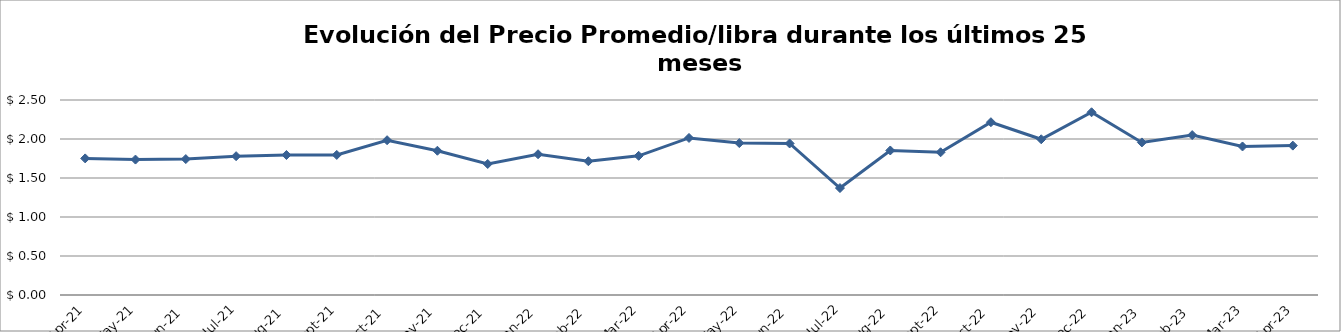
| Category | Series 0 |
|---|---|
| 2021-04-01 | 1.751 |
| 2021-05-01 | 1.736 |
| 2021-06-01 | 1.743 |
| 2021-07-01 | 1.78 |
| 2021-08-01 | 1.795 |
| 2021-09-01 | 1.796 |
| 2021-10-01 | 1.985 |
| 2021-11-01 | 1.849 |
| 2021-12-01 | 1.68 |
| 2022-01-01 | 1.805 |
| 2022-02-01 | 1.715 |
| 2022-03-01 | 1.784 |
| 2022-04-01 | 2.013 |
| 2022-05-01 | 1.948 |
| 2022-06-01 | 1.943 |
| 2022-07-01 | 1.371 |
| 2022-08-01 | 1.853 |
| 2022-09-01 | 1.83 |
| 2022-10-01 | 2.215 |
| 2022-11-01 | 1.996 |
| 2022-12-01 | 2.343 |
| 2023-01-01 | 1.956 |
| 2023-02-01 | 2.05 |
| 2023-03-01 | 1.904 |
| 2023-04-01 | 1.915 |